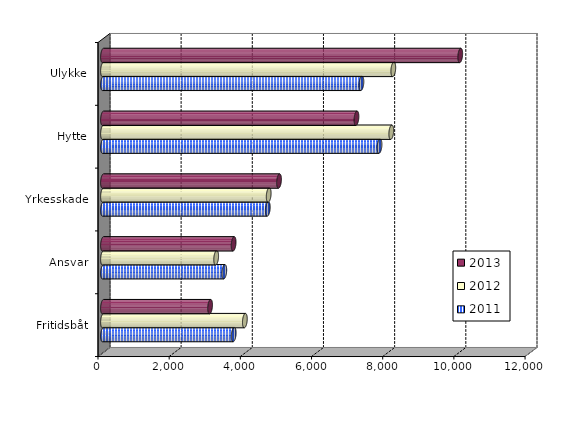
| Category | 2011 | 2012 | 2013 |
|---|---|---|---|
| Fritidsbåt | 3672.502 | 3986 | 3009 |
| Ansvar | 3407.921 | 3180 | 3670 |
| Yrkesskade | 4630.43 | 4656 | 4946 |
| Hytte | 7769.726 | 8100 | 7122 |
| Ulykke | 7261.126 | 8157 | 10038 |